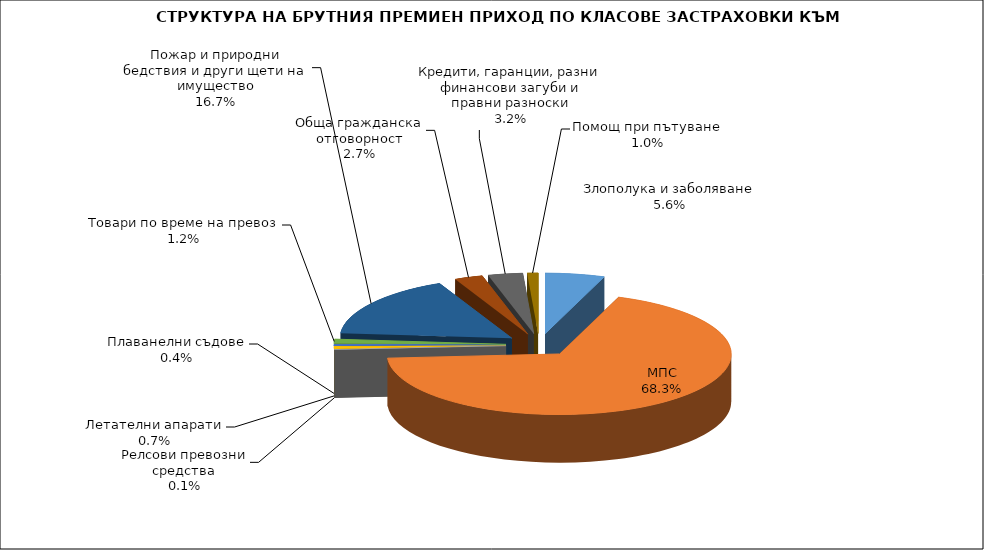
| Category | Злополука и заболяване МПС Релсови превозни средства Летателни апарати Плаванелни съдове Товари по време на превоз Пожар и природни бедствия и други щети на имущество Обща гражданска отговорност Кредити, гаранции, разни финансови загуби и правни разноски  |
|---|---|
| Злополука и заболяване | 0.056 |
| МПС | 0.683 |
| Релсови превозни средства | 0.001 |
| Летателни апарати | 0.007 |
| Плаванелни съдове | 0.004 |
| Товари по време на превоз | 0.012 |
| Пожар и природни бедствия и други щети на имущество | 0.167 |
| Обща гражданска отговорност | 0.027 |
| Кредити, гаранции, разни финансови загуби и правни разноски | 0.032 |
| Помощ при пътуване | 0.01 |